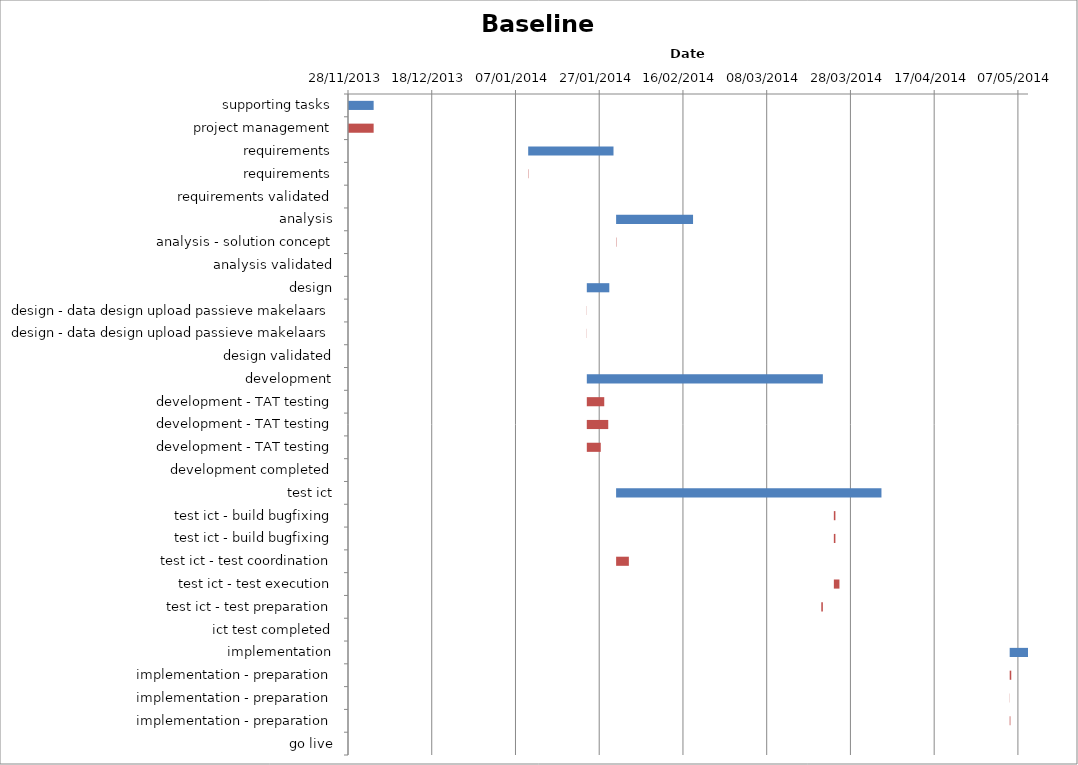
| Category | Baseline start | Actual duration |
|---|---|---|
| supporting tasks | 41606.333 | 6.083 |
| project management | 41606.333 | 6.083 |
| requirements | 41649.333 | 20.375 |
| requirements | 41649.333 | 0.083 |
| requirements validated | 41669.708 | 0 |
| analysis | 41670.333 | 18.375 |
| analysis - solution concept | 41670.333 | 0.083 |
| analysis validated | 41688.708 | 0 |
| design | 41663.333 | 5.375 |
| design - data design upload passieve makelaars | 41663.333 | 0.042 |
| design - data design upload passieve makelaars | 41663.333 | 0.042 |
| design validated | 41668.708 | 0 |
| development | 41663.333 | 56.375 |
| development - TAT testing | 41663.333 | 4.167 |
| development - TAT testing | 41663.333 | 5.125 |
| development - TAT testing | 41663.333 | 3.333 |
| development completed | 41719.708 | 0 |
| test ict | 41670.333 | 63.375 |
| test ict - build bugfixing | 41722.333 | 0.375 |
| test ict - build bugfixing | 41722.333 | 0.375 |
| test ict - test coordination | 41670.333 | 3.042 |
| test ict - test execution | 41722.333 | 1.333 |
| test ict - test preparation | 41719.333 | 0.375 |
| ict test completed | 41733.708 | 0 |
| implementation | 41764.333 | 4.375 |
| implementation - preparation | 41764.333 | 0.375 |
| implementation - preparation | 41764.333 | 0.042 |
| implementation - preparation | 41764.333 | 0.167 |
| go live | 41768.708 | 0 |